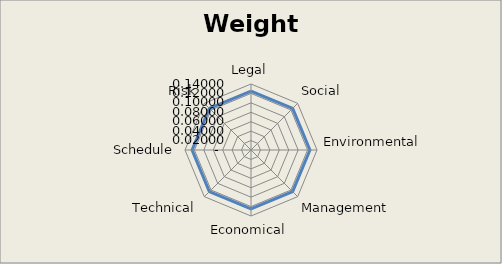
| Category | Series 0 |
|---|---|
| Legal | 0.125 |
| Social | 0.125 |
| Environmental | 0.125 |
| Management | 0.125 |
| Economical | 0.125 |
| Technical | 0.125 |
| Schedule | 0.125 |
| Risk | 0.125 |